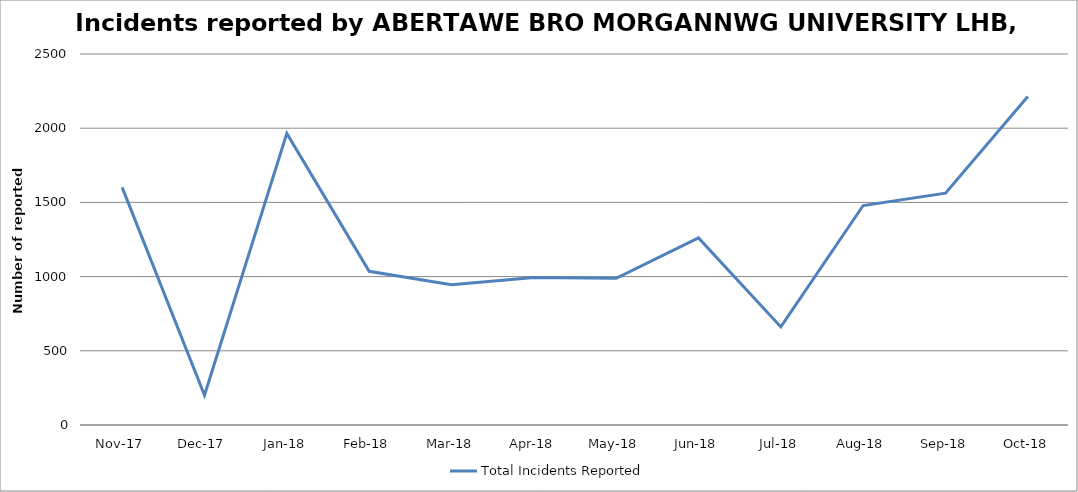
| Category | Total Incidents Reported |
|---|---|
| Nov-17 | 1601 |
| Dec-17 | 200 |
| Jan-18 | 1965 |
| Feb-18 | 1036 |
| Mar-18 | 945 |
| Apr-18 | 994 |
| May-18 | 989 |
| Jun-18 | 1261 |
| Jul-18 | 661 |
| Aug-18 | 1479 |
| Sep-18 | 1562 |
| Oct-18 | 2214 |